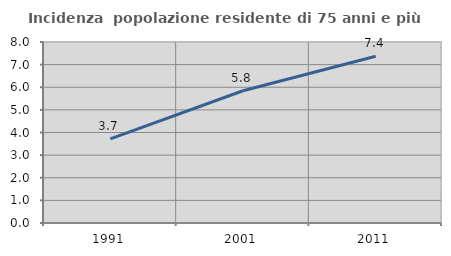
| Category | Incidenza  popolazione residente di 75 anni e più |
|---|---|
| 1991.0 | 3.721 |
| 2001.0 | 5.844 |
| 2011.0 | 7.371 |